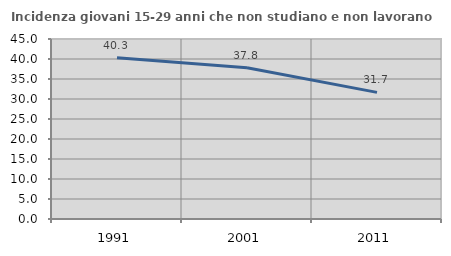
| Category | Incidenza giovani 15-29 anni che non studiano e non lavorano  |
|---|---|
| 1991.0 | 40.29 |
| 2001.0 | 37.791 |
| 2011.0 | 31.655 |